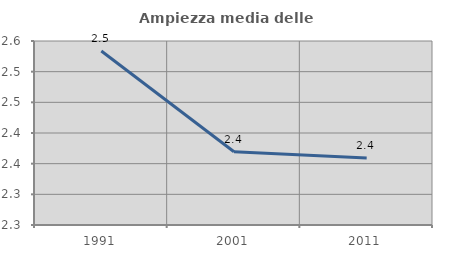
| Category | Ampiezza media delle famiglie |
|---|---|
| 1991.0 | 2.534 |
| 2001.0 | 2.369 |
| 2011.0 | 2.359 |